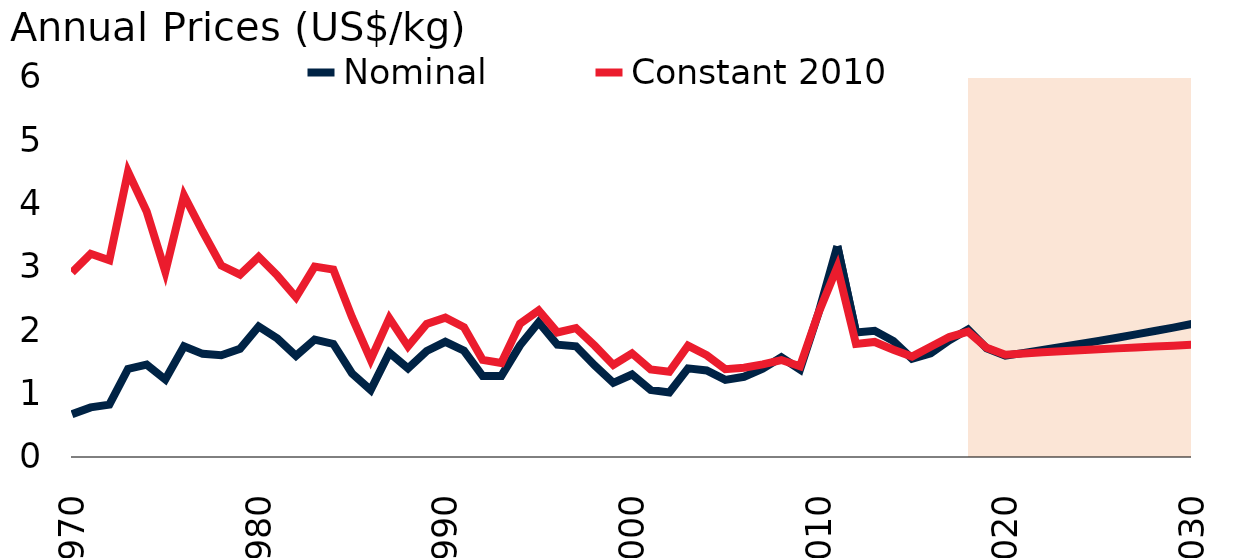
| Category | Nominal | Constant 2010 |
|---|---|---|
| 1970.0 | 0.676 | 2.913 |
| 1971.0 | 0.783 | 3.208 |
| 1972.0 | 0.827 | 3.105 |
| 1973.0 | 1.391 | 4.502 |
| 1974.0 | 1.459 | 3.876 |
| 1975.0 | 1.223 | 2.925 |
| 1976.0 | 1.748 | 4.13 |
| 1977.0 | 1.629 | 3.56 |
| 1978.0 | 1.607 | 3.022 |
| 1979.0 | 1.707 | 2.879 |
| 1980.0 | 2.062 | 3.161 |
| 1981.0 | 1.871 | 2.865 |
| 1982.0 | 1.597 | 2.521 |
| 1983.0 | 1.854 | 3.006 |
| 1984.0 | 1.785 | 2.959 |
| 1985.0 | 1.318 | 2.209 |
| 1986.0 | 1.056 | 1.539 |
| 1987.0 | 1.648 | 2.191 |
| 1988.0 | 1.399 | 1.747 |
| 1989.0 | 1.674 | 2.102 |
| 1990.0 | 1.819 | 2.2 |
| 1991.0 | 1.677 | 2.048 |
| 1992.0 | 1.278 | 1.532 |
| 1993.0 | 1.28 | 1.483 |
| 1994.0 | 1.763 | 2.105 |
| 1995.0 | 2.128 | 2.315 |
| 1996.0 | 1.773 | 1.967 |
| 1997.0 | 1.748 | 2.034 |
| 1998.0 | 1.445 | 1.758 |
| 1999.0 | 1.171 | 1.453 |
| 2000.0 | 1.302 | 1.637 |
| 2001.0 | 1.058 | 1.382 |
| 2002.0 | 1.019 | 1.347 |
| 2003.0 | 1.399 | 1.757 |
| 2004.0 | 1.366 | 1.606 |
| 2005.0 | 1.217 | 1.388 |
| 2006.0 | 1.267 | 1.408 |
| 2007.0 | 1.395 | 1.462 |
| 2008.0 | 1.574 | 1.531 |
| 2009.0 | 1.382 | 1.433 |
| 2010.0 | 2.283 | 2.283 |
| 2011.0 | 3.329 | 2.999 |
| 2012.0 | 1.967 | 1.785 |
| 2013.0 | 1.993 | 1.817 |
| 2014.0 | 1.832 | 1.693 |
| 2015.0 | 1.552 | 1.586 |
| 2016.0 | 1.636 | 1.74 |
| 2017.0 | 1.843 | 1.894 |
| 2018.0 | 2.015 | 1.979 |
| 2019.0 | 1.717 | 1.726 |
| 2020.0 | 1.6 | 1.616 |
| 2021.0 | 1.644 | 1.635 |
| 2022.0 | 1.689 | 1.652 |
| 2023.0 | 1.736 | 1.669 |
| 2024.0 | 1.784 | 1.685 |
| 2025.0 | 1.833 | 1.7 |
| 2026.0 | 1.884 | 1.715 |
| 2027.0 | 1.935 | 1.73 |
| 2028.0 | 1.989 | 1.744 |
| 2029.0 | 2.044 | 1.758 |
| 2030.0 | 2.1 | 1.771 |